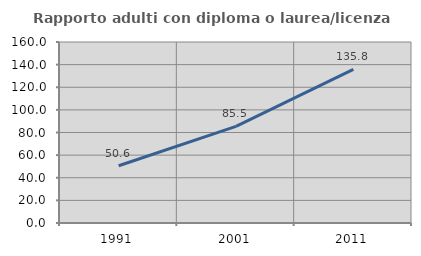
| Category | Rapporto adulti con diploma o laurea/licenza media  |
|---|---|
| 1991.0 | 50.623 |
| 2001.0 | 85.466 |
| 2011.0 | 135.763 |